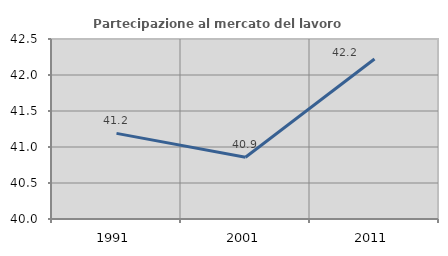
| Category | Partecipazione al mercato del lavoro  femminile |
|---|---|
| 1991.0 | 41.189 |
| 2001.0 | 40.858 |
| 2011.0 | 42.222 |